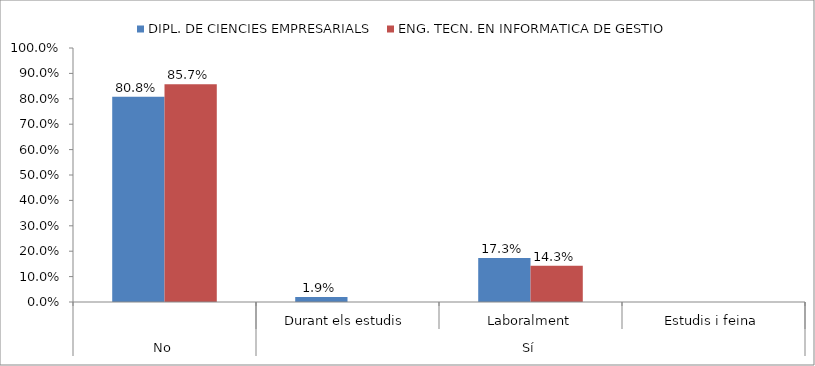
| Category | DIPL. DE CIENCIES EMPRESARIALS | ENG. TECN. EN INFORMATICA DE GESTIO |
|---|---|---|
| 0 | 0.808 | 0.857 |
| 1 | 0.019 | 0 |
| 2 | 0.173 | 0.143 |
| 3 | 0 | 0 |